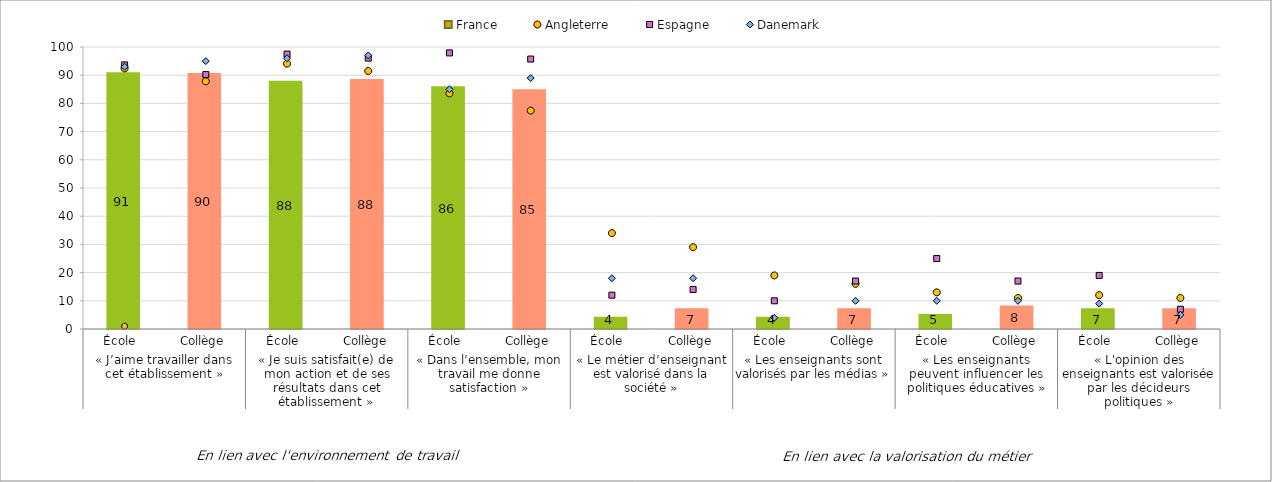
| Category | France |
|---|---|
| 0 | 90.735 |
| 1 | 90.41 |
| 2 | 87.673 |
| 3 | 88.295 |
| 4 | 85.747 |
| 5 | 84.658 |
| 6 | 4 |
| 7 | 7 |
| 8 | 4 |
| 9 | 7 |
| 10 | 5 |
| 11 | 8 |
| 12 | 7 |
| 13 | 7 |